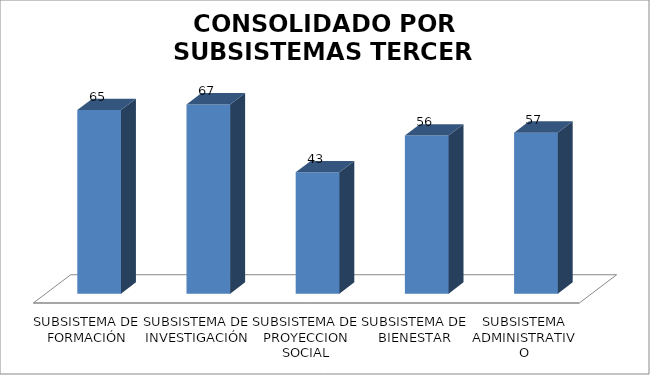
| Category | Series 0 |
|---|---|
| SUBSISTEMA DE FORMACIÓN | 65 |
| SUBSISTEMA DE INVESTIGACIÓN | 67 |
| SUBSISTEMA DE PROYECCION SOCIAL | 43 |
| SUBSISTEMA DE BIENESTAR | 56 |
| SUBSISTEMA ADMINISTRATIVO | 57 |